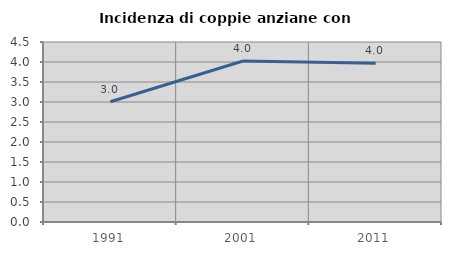
| Category | Incidenza di coppie anziane con figli |
|---|---|
| 1991.0 | 3.005 |
| 2001.0 | 4.025 |
| 2011.0 | 3.967 |